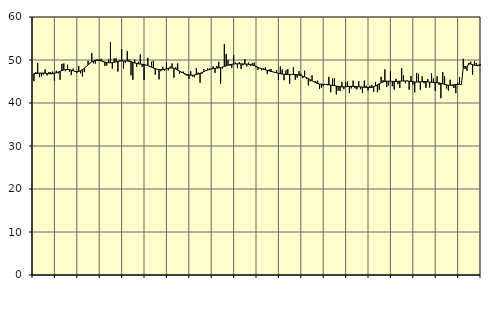
| Category | Piggar | Series 1 |
|---|---|---|
| nan | 45.1 | 46.87 |
| 1.0 | 47.2 | 46.85 |
| 1.0 | 49.3 | 46.89 |
| 1.0 | 46 | 46.94 |
| 1.0 | 46.2 | 46.96 |
| 1.0 | 46.6 | 46.96 |
| 1.0 | 47.8 | 46.92 |
| 1.0 | 46.4 | 46.87 |
| 1.0 | 47.2 | 46.81 |
| 1.0 | 47.2 | 46.78 |
| 1.0 | 47.3 | 46.81 |
| 1.0 | 45.2 | 46.9 |
| nan | 47.5 | 47.04 |
| 2.0 | 46.9 | 47.21 |
| 2.0 | 45.4 | 47.38 |
| 2.0 | 49.1 | 47.54 |
| 2.0 | 49.2 | 47.68 |
| 2.0 | 47.4 | 47.78 |
| 2.0 | 48.9 | 47.81 |
| 2.0 | 47.3 | 47.76 |
| 2.0 | 46.5 | 47.64 |
| 2.0 | 48 | 47.49 |
| 2.0 | 47.3 | 47.36 |
| 2.0 | 47 | 47.3 |
| nan | 48.6 | 47.34 |
| 3.0 | 46.9 | 47.49 |
| 3.0 | 46.2 | 47.75 |
| 3.0 | 47.2 | 48.09 |
| 3.0 | 48.5 | 48.48 |
| 3.0 | 49.8 | 48.87 |
| 3.0 | 49.2 | 49.24 |
| 3.0 | 51.6 | 49.55 |
| 3.0 | 49.2 | 49.78 |
| 3.0 | 49.2 | 49.91 |
| 3.0 | 50.2 | 49.94 |
| 3.0 | 50.1 | 49.89 |
| nan | 50.3 | 49.78 |
| 4.0 | 49.8 | 49.64 |
| 4.0 | 48.6 | 49.51 |
| 4.0 | 48.7 | 49.42 |
| 4.0 | 50.1 | 49.37 |
| 4.0 | 54.2 | 49.36 |
| 4.0 | 48 | 49.41 |
| 4.0 | 50.4 | 49.49 |
| 4.0 | 50.4 | 49.58 |
| 4.0 | 47.3 | 49.68 |
| 4.0 | 50 | 49.75 |
| 4.0 | 52.5 | 49.79 |
| nan | 48 | 49.8 |
| 5.0 | 49.3 | 49.8 |
| 5.0 | 52.1 | 49.77 |
| 5.0 | 50.1 | 49.7 |
| 5.0 | 46.4 | 49.6 |
| 5.0 | 45.4 | 49.47 |
| 5.0 | 50.1 | 49.33 |
| 5.0 | 48.4 | 49.2 |
| 5.0 | 49.6 | 49.11 |
| 5.0 | 51.3 | 49.05 |
| 5.0 | 48.4 | 49 |
| 5.0 | 45.4 | 48.94 |
| nan | 48.8 | 48.84 |
| 6.0 | 50.5 | 48.7 |
| 6.0 | 48.4 | 48.53 |
| 6.0 | 49.6 | 48.32 |
| 6.0 | 49.8 | 48.14 |
| 6.0 | 46.6 | 47.99 |
| 6.0 | 47.8 | 47.86 |
| 6.0 | 45.5 | 47.78 |
| 6.0 | 47.4 | 47.75 |
| 6.0 | 48.4 | 47.77 |
| 6.0 | 47.5 | 47.84 |
| 6.0 | 49.4 | 47.94 |
| nan | 47.6 | 48.07 |
| 7.0 | 48.5 | 48.14 |
| 7.0 | 49.2 | 48.15 |
| 7.0 | 45.9 | 48.07 |
| 7.0 | 48.3 | 47.9 |
| 7.0 | 49.2 | 47.67 |
| 7.0 | 46.8 | 47.42 |
| 7.0 | 47 | 47.18 |
| 7.0 | 47.3 | 46.97 |
| 7.0 | 46.6 | 46.79 |
| 7.0 | 46.3 | 46.63 |
| 7.0 | 45.6 | 46.52 |
| nan | 47.4 | 46.46 |
| 8.0 | 46.1 | 46.45 |
| 8.0 | 46 | 46.5 |
| 8.0 | 48.1 | 46.6 |
| 8.0 | 47.1 | 46.74 |
| 8.0 | 44.7 | 46.91 |
| 8.0 | 46.8 | 47.09 |
| 8.0 | 47.9 | 47.28 |
| 8.0 | 47.5 | 47.48 |
| 8.0 | 48 | 47.65 |
| 8.0 | 48 | 47.79 |
| 8.0 | 47.9 | 47.92 |
| nan | 48.5 | 48.01 |
| 9.0 | 47 | 48.07 |
| 9.0 | 48.6 | 48.12 |
| 9.0 | 49.6 | 48.17 |
| 9.0 | 44.5 | 48.25 |
| 9.0 | 48 | 48.36 |
| 9.0 | 53.7 | 48.5 |
| 9.0 | 51.4 | 48.66 |
| 9.0 | 50 | 48.8 |
| 9.0 | 48.7 | 48.92 |
| 9.0 | 48.2 | 49.02 |
| 9.0 | 51.1 | 49.08 |
| nan | 49.4 | 49.11 |
| 10.0 | 48.1 | 49.12 |
| 10.0 | 49.5 | 49.12 |
| 10.0 | 47.9 | 49.11 |
| 10.0 | 48.8 | 49.09 |
| 10.0 | 50.2 | 49.07 |
| 10.0 | 48.5 | 49.05 |
| 10.0 | 49.4 | 49 |
| 10.0 | 48.7 | 48.93 |
| 10.0 | 49.3 | 48.82 |
| 10.0 | 49.4 | 48.68 |
| 10.0 | 48.3 | 48.51 |
| nan | 47.7 | 48.32 |
| 11.0 | 48.1 | 48.14 |
| 11.0 | 47.6 | 47.98 |
| 11.0 | 48 | 47.84 |
| 11.0 | 48.3 | 47.71 |
| 11.0 | 46.7 | 47.58 |
| 11.0 | 47.8 | 47.46 |
| 11.0 | 47.9 | 47.36 |
| 11.0 | 47.2 | 47.24 |
| 11.0 | 47.2 | 47.13 |
| 11.0 | 47.6 | 47.02 |
| 11.0 | 45.4 | 46.91 |
| nan | 48.5 | 46.82 |
| 12.0 | 47.8 | 46.74 |
| 12.0 | 45.3 | 46.68 |
| 12.0 | 47.6 | 46.64 |
| 12.0 | 47.9 | 46.63 |
| 12.0 | 44.5 | 46.63 |
| 12.0 | 46.6 | 46.64 |
| 12.0 | 48.3 | 46.64 |
| 12.0 | 45.4 | 46.62 |
| 12.0 | 45.9 | 46.56 |
| 12.0 | 47.4 | 46.47 |
| 12.0 | 46.8 | 46.37 |
| nan | 45.8 | 46.25 |
| 13.0 | 47.5 | 46.1 |
| 13.0 | 45.6 | 45.91 |
| 13.0 | 44.1 | 45.69 |
| 13.0 | 45 | 45.44 |
| 13.0 | 46.4 | 45.18 |
| 13.0 | 45.1 | 44.94 |
| 13.0 | 45.1 | 44.71 |
| 13.0 | 45.2 | 44.54 |
| 13.0 | 43.3 | 44.43 |
| 13.0 | 43.6 | 44.37 |
| 13.0 | 43.9 | 44.33 |
| nan | 44.2 | 44.3 |
| 14.0 | 44.4 | 44.26 |
| 14.0 | 46.1 | 44.21 |
| 14.0 | 42.5 | 44.17 |
| 14.0 | 45.7 | 44.11 |
| 14.0 | 45.7 | 44.04 |
| 14.0 | 42 | 43.95 |
| 14.0 | 42.9 | 43.86 |
| 14.0 | 42.8 | 43.79 |
| 14.0 | 44.9 | 43.75 |
| 14.0 | 43.2 | 43.75 |
| 14.0 | 44.8 | 43.78 |
| nan | 45 | 43.82 |
| 15.0 | 42.3 | 43.85 |
| 15.0 | 43.4 | 43.87 |
| 15.0 | 45.2 | 43.87 |
| 15.0 | 43.4 | 43.85 |
| 15.0 | 43.2 | 43.81 |
| 15.0 | 45.1 | 43.77 |
| 15.0 | 43.2 | 43.75 |
| 15.0 | 42.3 | 43.72 |
| 15.0 | 45.2 | 43.67 |
| 15.0 | 44 | 43.62 |
| 15.0 | 42.9 | 43.59 |
| nan | 44 | 43.59 |
| 16.0 | 44.2 | 43.64 |
| 16.0 | 42.6 | 43.78 |
| 16.0 | 44.9 | 43.98 |
| 16.0 | 42.5 | 44.21 |
| 16.0 | 43 | 44.47 |
| 16.0 | 46.1 | 44.71 |
| 16.0 | 45.3 | 44.89 |
| 16.0 | 47.8 | 45.01 |
| 16.0 | 43.7 | 45.07 |
| 16.0 | 44.1 | 45.08 |
| 16.0 | 47.4 | 45.06 |
| nan | 43.9 | 45.03 |
| 17.0 | 43.1 | 45.02 |
| 17.0 | 45.6 | 45.02 |
| 17.0 | 44.4 | 45.03 |
| 17.0 | 43.5 | 45.06 |
| 17.0 | 48.1 | 45.1 |
| 17.0 | 46.4 | 45.13 |
| 17.0 | 44.6 | 45.13 |
| 17.0 | 45.2 | 45.11 |
| 17.0 | 43.1 | 45.07 |
| 17.0 | 46.3 | 45.02 |
| 17.0 | 44.3 | 44.96 |
| nan | 42.5 | 44.9 |
| 18.0 | 47 | 44.88 |
| 18.0 | 46.8 | 44.88 |
| 18.0 | 43.1 | 44.92 |
| 18.0 | 46.2 | 44.96 |
| 18.0 | 44.6 | 44.98 |
| 18.0 | 43.5 | 44.95 |
| 18.0 | 45.6 | 44.91 |
| 18.0 | 43.6 | 44.86 |
| 18.0 | 46.9 | 44.82 |
| 18.0 | 45.7 | 44.78 |
| 18.0 | 42.8 | 44.75 |
| nan | 46.2 | 44.72 |
| 19.0 | 44.2 | 44.67 |
| 19.0 | 41.1 | 44.57 |
| 19.0 | 47.2 | 44.45 |
| 19.0 | 46.2 | 44.32 |
| 19.0 | 43.4 | 44.22 |
| 19.0 | 42.9 | 44.16 |
| 19.0 | 45.4 | 44.15 |
| 19.0 | 44 | 44.18 |
| 19.0 | 43.5 | 44.24 |
| 19.0 | 42.3 | 44.29 |
| 19.0 | 44.7 | 44.32 |
| nan | 46 | 44.33 |
| 20.0 | 44.3 | 44.29 |
| 20.0 | 50.3 | 48.24 |
| 20.0 | 47.9 | 48.51 |
| 20.0 | 47.5 | 48.34 |
| 20.0 | 48.9 | 49.24 |
| 20.0 | 49.6 | 49.06 |
| 20.0 | 46.6 | 48.91 |
| 20.0 | 49.7 | 48.79 |
| 20.0 | 49.3 | 48.72 |
| 20.0 | 48.9 | 48.69 |
| 20.0 | 49.1 | 48.7 |